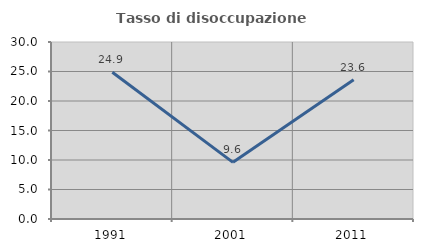
| Category | Tasso di disoccupazione giovanile  |
|---|---|
| 1991.0 | 24.868 |
| 2001.0 | 9.6 |
| 2011.0 | 23.596 |